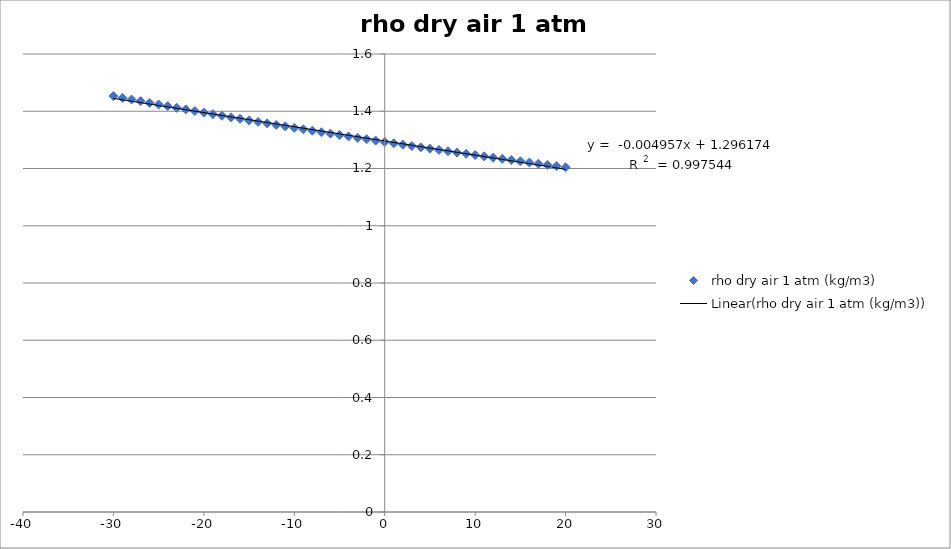
| Category | rho dry air 1 atm (kg/m3) |
|---|---|
| -30.0 | 1.453 |
| -29.0 | 1.447 |
| -28.0 | 1.441 |
| -27.0 | 1.435 |
| -26.0 | 1.429 |
| -25.0 | 1.424 |
| -24.0 | 1.418 |
| -23.0 | 1.412 |
| -22.0 | 1.406 |
| -21.0 | 1.401 |
| -20.0 | 1.395 |
| -19.0 | 1.39 |
| -18.0 | 1.384 |
| -17.0 | 1.379 |
| -16.0 | 1.373 |
| -15.0 | 1.368 |
| -14.0 | 1.363 |
| -13.0 | 1.358 |
| -12.0 | 1.352 |
| -11.0 | 1.347 |
| -10.0 | 1.342 |
| -9.0 | 1.337 |
| -8.0 | 1.332 |
| -7.0 | 1.327 |
| -6.0 | 1.322 |
| -5.0 | 1.317 |
| -4.0 | 1.312 |
| -3.0 | 1.307 |
| -2.0 | 1.302 |
| -1.0 | 1.297 |
| 0.0 | 1.293 |
| 1.0 | 1.288 |
| 2.0 | 1.283 |
| 3.0 | 1.279 |
| 4.0 | 1.274 |
| 5.0 | 1.269 |
| 6.0 | 1.265 |
| 7.0 | 1.26 |
| 8.0 | 1.256 |
| 9.0 | 1.251 |
| 10.0 | 1.247 |
| 11.0 | 1.243 |
| 12.0 | 1.238 |
| 13.0 | 1.234 |
| 14.0 | 1.23 |
| 15.0 | 1.225 |
| 16.0 | 1.221 |
| 17.0 | 1.217 |
| 18.0 | 1.213 |
| 19.0 | 1.208 |
| 20.0 | 1.204 |